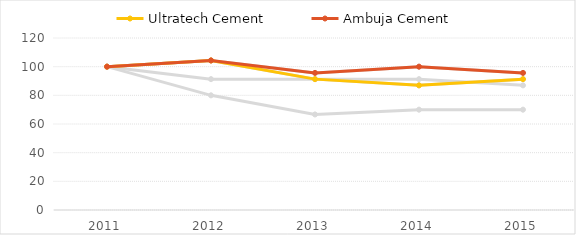
| Category | ACC Ltd | Ambuja Cement | JK Lakshmi Cement | Ultratech Cement |
|---|---|---|---|---|
| 2011.0 | 100 | 100 | 100 | 100 |
| 2012.0 | 91.304 | 104.348 | 80 | 104.348 |
| 2013.0 | 91.304 | 95.652 | 66.667 | 91.304 |
| 2014.0 | 91.304 | 100 | 70 | 86.957 |
| 2015.0 | 86.957 | 95.652 | 70 | 91.304 |